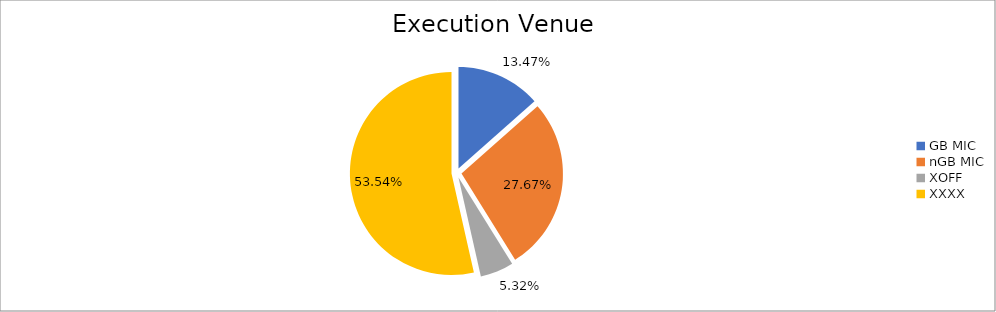
| Category | Series 0 |
|---|---|
| GB MIC | 1221950.144 |
| nGB MIC | 2511170.514 |
| XOFF | 482577.006 |
| XXXX | 4858402.376 |